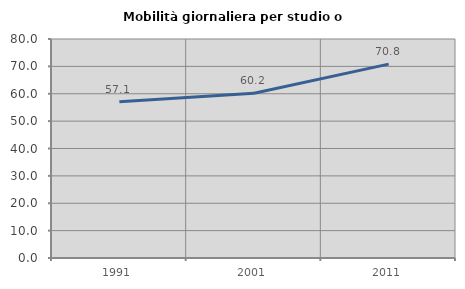
| Category | Mobilità giornaliera per studio o lavoro |
|---|---|
| 1991.0 | 57.095 |
| 2001.0 | 60.193 |
| 2011.0 | 70.833 |